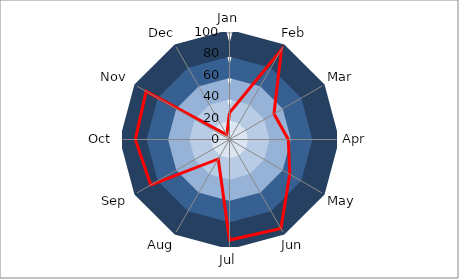
| Category | 1st Ring | 2nd Ring | 3rd Ring | 4th Ring | 5th Ring | Data |
|---|---|---|---|---|---|---|
| Jan | 10 | 30 | 50 | 70 | 90 | 25 |
| Feb | 10 | 30 | 50 | 70 | 90 | 97 |
| Mar | 10 | 30 | 50 | 70 | 90 | 48 |
| Apr | 10 | 30 | 50 | 70 | 90 | 55 |
| May | 10 | 30 | 50 | 70 | 90 | 65 |
| Jun | 10 | 30 | 50 | 70 | 90 | 96 |
| Jul | 10 | 30 | 50 | 70 | 90 | 94 |
| Aug | 10 | 30 | 50 | 70 | 90 | 21 |
| Sep | 10 | 30 | 50 | 70 | 90 | 85 |
| Oct | 10 | 30 | 50 | 70 | 90 | 88 |
| Nov | 10 | 30 | 50 | 70 | 90 | 90 |
| Dec | 10 | 30 | 50 | 70 | 90 | 5 |